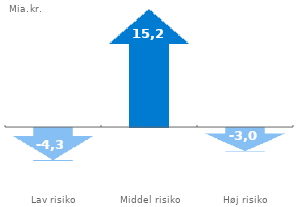
| Category | Serienavn |
|---|---|
| Lav risiko | -4.25 |
| Middel risiko | 15.249 |
| Høj risiko | -3.025 |